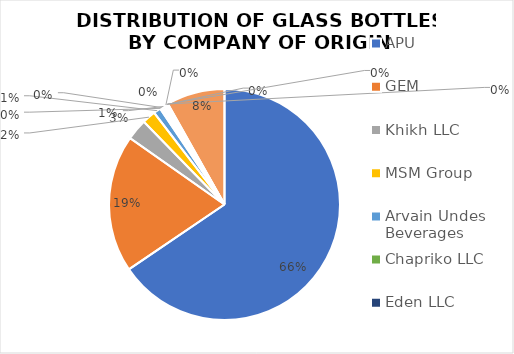
| Category | Series 0 |
|---|---|
| APU | 908.66 |
| GEM | 266.81 |
| Khikh LLC | 40.964 |
| MSM Group | 26.215 |
| Arvain Undes Beverages | 13.92 |
| Chapriko LLC | 1.69 |
| Eden LLC | 3.64 |
| Nomin Foods LLC | 4 |
| Alkogroup (Хярын нуур ХХК) | 2.72 |
| Küvsgöl Khuns XK | 1.76 |
| Shine Ekhlel LLC | 1.5 |
| Zavkhan Bayalag XK | 0.98 |
| Altan Khuns Group LLC | 1.08 |
| Others / unidentified | 113.06 |